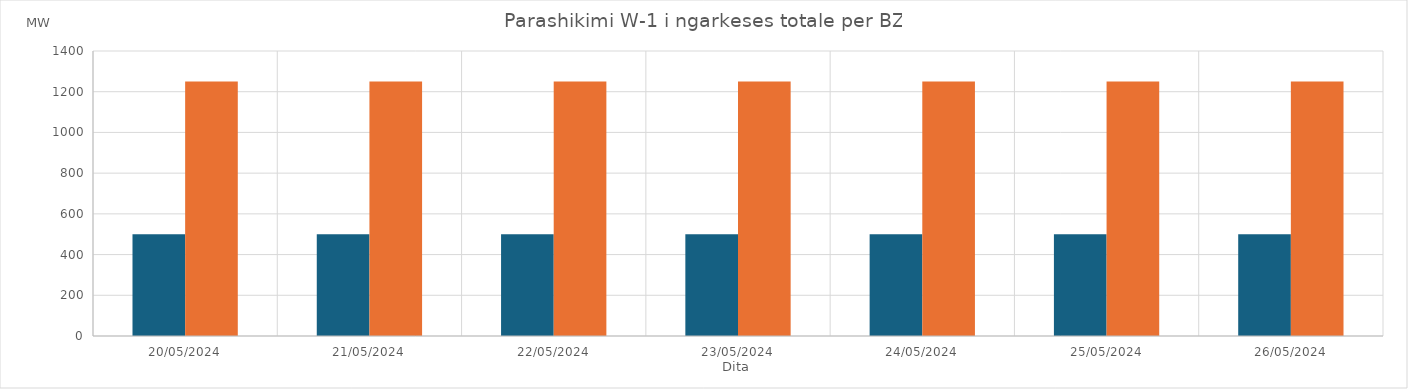
| Category | Min (MW) | Max (MW) |
|---|---|---|
| 20/05/2024 | 500 | 1250 |
| 21/05/2024 | 500 | 1250 |
| 22/05/2024 | 500 | 1250 |
| 23/05/2024 | 500 | 1250 |
| 24/05/2024 | 500 | 1250 |
| 25/05/2024 | 500 | 1250 |
| 26/05/2024 | 500 | 1250 |